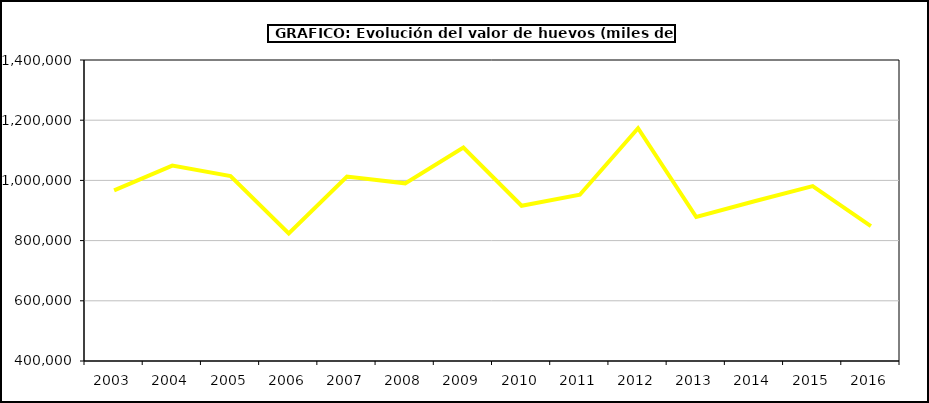
| Category | huevos |
|---|---|
| 2003.0 | 966991.3 |
| 2004.0 | 1049094.98 |
| 2005.0 | 1014518.979 |
| 2006.0 | 823874.691 |
| 2007.0 | 1012879.578 |
| 2008.0 | 990180.415 |
| 2009.0 | 1109356.704 |
| 2010.0 | 915832.84 |
| 2011.0 | 952462.311 |
| 2012.0 | 1173176.818 |
| 2013.0 | 878243.026 |
| 2014.0 | 930912.202 |
| 2015.0 | 980944.68 |
| 2016.0 | 848224 |